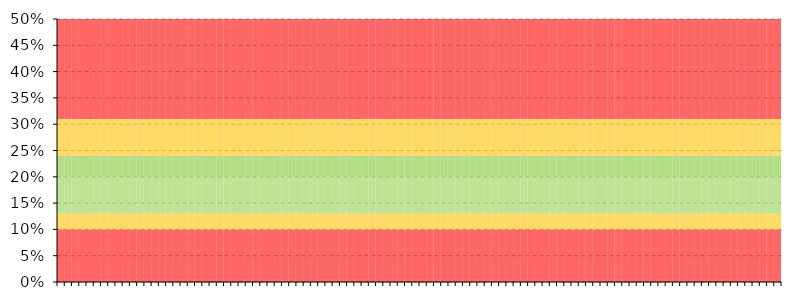
| Category | Series 1 | Series 2 | Series 3 | Series 4 | Series 5 | Series 6 |
|---|---|---|---|---|---|---|
| 0 | 0.1 | 0.03 | 0.07 | 0.04 | 0.07 | 0.26 |
| 1900-01-01 | 0.1 | 0.03 | 0.07 | 0.04 | 0.07 | 0.26 |
| 1900-01-02 | 0.1 | 0.03 | 0.07 | 0.04 | 0.07 | 0.26 |
| 1900-01-03 | 0.1 | 0.03 | 0.07 | 0.04 | 0.07 | 0.26 |
| 1900-01-04 | 0.1 | 0.03 | 0.07 | 0.04 | 0.07 | 0.26 |
| 1900-01-05 | 0.1 | 0.03 | 0.07 | 0.04 | 0.07 | 0.26 |
| 1900-01-06 | 0.1 | 0.03 | 0.07 | 0.04 | 0.07 | 0.26 |
| 1900-01-07 | 0.1 | 0.03 | 0.07 | 0.04 | 0.07 | 0.26 |
| 1900-01-08 | 0.1 | 0.03 | 0.07 | 0.04 | 0.07 | 0.26 |
| 1900-01-09 | 0.1 | 0.03 | 0.07 | 0.04 | 0.07 | 0.26 |
| 1900-01-10 | 0.1 | 0.03 | 0.07 | 0.04 | 0.07 | 0.26 |
| 1900-01-11 | 0.1 | 0.03 | 0.07 | 0.04 | 0.07 | 0.26 |
| 1900-01-12 | 0.1 | 0.03 | 0.07 | 0.04 | 0.07 | 0.26 |
| 1900-01-13 | 0.1 | 0.03 | 0.07 | 0.04 | 0.07 | 0.26 |
| 1900-01-14 | 0.1 | 0.03 | 0.07 | 0.04 | 0.07 | 0.26 |
| 1900-01-15 | 0.1 | 0.03 | 0.07 | 0.04 | 0.07 | 0.26 |
| 1900-01-16 | 0.1 | 0.03 | 0.07 | 0.04 | 0.07 | 0.26 |
| 1900-01-17 | 0.1 | 0.03 | 0.07 | 0.04 | 0.07 | 0.26 |
| 1900-01-18 | 0.1 | 0.03 | 0.07 | 0.04 | 0.07 | 0.26 |
| 1900-01-19 | 0.1 | 0.03 | 0.07 | 0.04 | 0.07 | 0.26 |
| 1900-01-20 | 0.1 | 0.03 | 0.07 | 0.04 | 0.07 | 0.26 |
| 1900-01-21 | 0.1 | 0.03 | 0.07 | 0.04 | 0.07 | 0.26 |
| 1900-01-22 | 0.1 | 0.03 | 0.07 | 0.04 | 0.07 | 0.26 |
| 1900-01-23 | 0.1 | 0.03 | 0.07 | 0.04 | 0.07 | 0.26 |
| 1900-01-24 | 0.1 | 0.03 | 0.07 | 0.04 | 0.07 | 0.26 |
| 1900-01-25 | 0.1 | 0.03 | 0.07 | 0.04 | 0.07 | 0.26 |
| 1900-01-26 | 0.1 | 0.03 | 0.07 | 0.04 | 0.07 | 0.26 |
| 1900-01-27 | 0.1 | 0.03 | 0.07 | 0.04 | 0.07 | 0.26 |
| 1900-01-28 | 0.1 | 0.03 | 0.07 | 0.04 | 0.07 | 0.26 |
| 1900-01-29 | 0.1 | 0.03 | 0.07 | 0.04 | 0.07 | 0.26 |
| 1900-01-30 | 0.1 | 0.03 | 0.07 | 0.04 | 0.07 | 0.26 |
| 1900-01-31 | 0.1 | 0.03 | 0.07 | 0.04 | 0.07 | 0.26 |
| 1900-02-01 | 0.1 | 0.03 | 0.07 | 0.04 | 0.07 | 0.26 |
| 1900-02-02 | 0.1 | 0.03 | 0.07 | 0.04 | 0.07 | 0.26 |
| 1900-02-03 | 0.1 | 0.03 | 0.07 | 0.04 | 0.07 | 0.26 |
| 1900-02-04 | 0.1 | 0.03 | 0.07 | 0.04 | 0.07 | 0.26 |
| 1900-02-05 | 0.1 | 0.03 | 0.07 | 0.04 | 0.07 | 0.26 |
| 1900-02-06 | 0.1 | 0.03 | 0.07 | 0.04 | 0.07 | 0.26 |
| 1900-02-07 | 0.1 | 0.03 | 0.07 | 0.04 | 0.07 | 0.26 |
| 1900-02-08 | 0.1 | 0.03 | 0.07 | 0.04 | 0.07 | 0.26 |
| 1900-02-09 | 0.1 | 0.03 | 0.07 | 0.04 | 0.07 | 0.26 |
| 1900-02-10 | 0.1 | 0.03 | 0.07 | 0.04 | 0.07 | 0.26 |
| 1900-02-11 | 0.1 | 0.03 | 0.07 | 0.04 | 0.07 | 0.26 |
| 1900-02-12 | 0.1 | 0.03 | 0.07 | 0.04 | 0.07 | 0.26 |
| 1900-02-13 | 0.1 | 0.03 | 0.07 | 0.04 | 0.07 | 0.26 |
| 1900-02-14 | 0.1 | 0.03 | 0.07 | 0.04 | 0.07 | 0.26 |
| 1900-02-15 | 0.1 | 0.03 | 0.07 | 0.04 | 0.07 | 0.26 |
| 1900-02-16 | 0.1 | 0.03 | 0.07 | 0.04 | 0.07 | 0.26 |
| 1900-02-17 | 0.1 | 0.03 | 0.07 | 0.04 | 0.07 | 0.26 |
| 1900-02-18 | 0.1 | 0.03 | 0.07 | 0.04 | 0.07 | 0.26 |
| 1900-02-19 | 0.1 | 0.03 | 0.07 | 0.04 | 0.07 | 0.26 |
| 1900-02-20 | 0.1 | 0.03 | 0.07 | 0.04 | 0.07 | 0.26 |
| 1900-02-21 | 0.1 | 0.03 | 0.07 | 0.04 | 0.07 | 0.26 |
| 1900-02-22 | 0.1 | 0.03 | 0.07 | 0.04 | 0.07 | 0.26 |
| 1900-02-23 | 0.1 | 0.03 | 0.07 | 0.04 | 0.07 | 0.26 |
| 1900-02-24 | 0.1 | 0.03 | 0.07 | 0.04 | 0.07 | 0.26 |
| 1900-02-25 | 0.1 | 0.03 | 0.07 | 0.04 | 0.07 | 0.26 |
| 1900-02-26 | 0.1 | 0.03 | 0.07 | 0.04 | 0.07 | 0.26 |
| 1900-02-27 | 0.1 | 0.03 | 0.07 | 0.04 | 0.07 | 0.26 |
| 1900-02-28 | 0.1 | 0.03 | 0.07 | 0.04 | 0.07 | 0.26 |
| 1900-02-28 | 0.1 | 0.03 | 0.07 | 0.04 | 0.07 | 0.26 |
| 1900-03-01 | 0.1 | 0.03 | 0.07 | 0.04 | 0.07 | 0.26 |
| 1900-03-02 | 0.1 | 0.03 | 0.07 | 0.04 | 0.07 | 0.26 |
| 1900-03-03 | 0.1 | 0.03 | 0.07 | 0.04 | 0.07 | 0.26 |
| 1900-03-04 | 0.1 | 0.03 | 0.07 | 0.04 | 0.07 | 0.26 |
| 1900-03-05 | 0.1 | 0.03 | 0.07 | 0.04 | 0.07 | 0.26 |
| 1900-03-06 | 0.1 | 0.03 | 0.07 | 0.04 | 0.07 | 0.26 |
| 1900-03-07 | 0.1 | 0.03 | 0.07 | 0.04 | 0.07 | 0.26 |
| 1900-03-08 | 0.1 | 0.03 | 0.07 | 0.04 | 0.07 | 0.26 |
| 1900-03-09 | 0.1 | 0.03 | 0.07 | 0.04 | 0.07 | 0.26 |
| 1900-03-10 | 0.1 | 0.03 | 0.07 | 0.04 | 0.07 | 0.26 |
| 1900-03-11 | 0.1 | 0.03 | 0.07 | 0.04 | 0.07 | 0.26 |
| 1900-03-12 | 0.1 | 0.03 | 0.07 | 0.04 | 0.07 | 0.26 |
| 1900-03-13 | 0.1 | 0.03 | 0.07 | 0.04 | 0.07 | 0.26 |
| 1900-03-14 | 0.1 | 0.03 | 0.07 | 0.04 | 0.07 | 0.26 |
| 1900-03-15 | 0.1 | 0.03 | 0.07 | 0.04 | 0.07 | 0.26 |
| 1900-03-16 | 0.1 | 0.03 | 0.07 | 0.04 | 0.07 | 0.26 |
| 1900-03-17 | 0.1 | 0.03 | 0.07 | 0.04 | 0.07 | 0.26 |
| 1900-03-18 | 0.1 | 0.03 | 0.07 | 0.04 | 0.07 | 0.26 |
| 1900-03-19 | 0.1 | 0.03 | 0.07 | 0.04 | 0.07 | 0.26 |
| 1900-03-20 | 0.1 | 0.03 | 0.07 | 0.04 | 0.07 | 0.26 |
| 1900-03-21 | 0.1 | 0.03 | 0.07 | 0.04 | 0.07 | 0.26 |
| 1900-03-22 | 0.1 | 0.03 | 0.07 | 0.04 | 0.07 | 0.26 |
| 1900-03-23 | 0.1 | 0.03 | 0.07 | 0.04 | 0.07 | 0.26 |
| 1900-03-24 | 0.1 | 0.03 | 0.07 | 0.04 | 0.07 | 0.26 |
| 1900-03-25 | 0.1 | 0.03 | 0.07 | 0.04 | 0.07 | 0.26 |
| 1900-03-26 | 0.1 | 0.03 | 0.07 | 0.04 | 0.07 | 0.26 |
| 1900-03-27 | 0.1 | 0.03 | 0.07 | 0.04 | 0.07 | 0.26 |
| 1900-03-28 | 0.1 | 0.03 | 0.07 | 0.04 | 0.07 | 0.26 |
| 1900-03-29 | 0.1 | 0.03 | 0.07 | 0.04 | 0.07 | 0.26 |
| 1900-03-30 | 0.1 | 0.03 | 0.07 | 0.04 | 0.07 | 0.26 |
| 1900-03-31 | 0.1 | 0.03 | 0.07 | 0.04 | 0.07 | 0.26 |
| 1900-04-01 | 0.1 | 0.03 | 0.07 | 0.04 | 0.07 | 0.26 |
| 1900-04-02 | 0.1 | 0.03 | 0.07 | 0.04 | 0.07 | 0.26 |
| 1900-04-03 | 0.1 | 0.03 | 0.07 | 0.04 | 0.07 | 0.26 |
| 1900-04-04 | 0.1 | 0.03 | 0.07 | 0.04 | 0.07 | 0.26 |
| 1900-04-05 | 0.1 | 0.03 | 0.07 | 0.04 | 0.07 | 0.26 |
| 1900-04-06 | 0.1 | 0.03 | 0.07 | 0.04 | 0.07 | 0.26 |
| 1900-04-07 | 0.1 | 0.03 | 0.07 | 0.04 | 0.07 | 0.26 |
| 1900-04-08 | 0.1 | 0.03 | 0.07 | 0.04 | 0.07 | 0.26 |